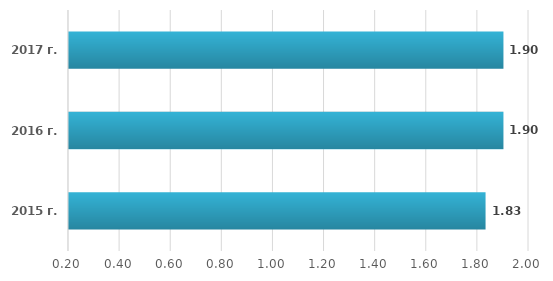
| Category | Series 0 |
|---|---|
| 2015 г. | 1.83 |
| 2016 г. | 1.9 |
| 2017 г. | 1.9 |